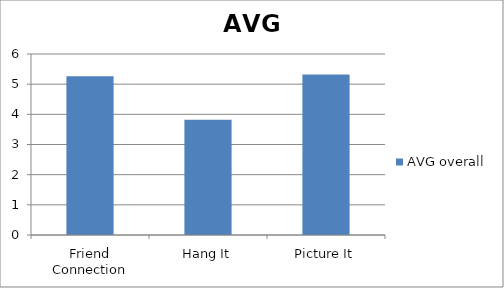
| Category | AVG overall |
|---|---|
| Friend Connection | 5.26 |
| Hang It | 3.82 |
| Picture It | 5.32 |